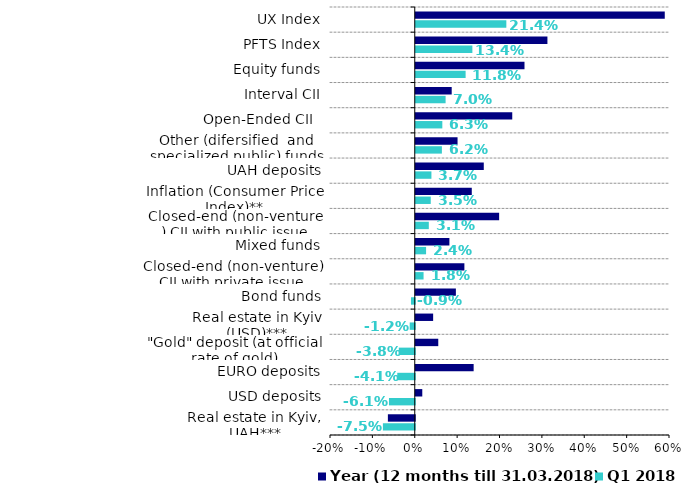
| Category | Q1 2018 | Year (12 months till 31.03.2018) |
|---|---|---|
| Real estate in Kyiv, UAH*** | -0.075 | -0.063 |
| USD deposits | -0.061 | 0.015 |
| EURO deposits | -0.041 | 0.137 |
| "Gold" deposit (at official rate of gold) | -0.038 | 0.053 |
| Real estate in Kyiv (USD)*** | -0.012 | 0.041 |
| Bond funds | -0.009 | 0.095 |
| Closed-end (non-venture) CII with private issue | 0.018 | 0.115 |
| Mixed funds | 0.024 | 0.079 |
| Closed-end (non-venture ) CII with public issue | 0.031 | 0.197 |
| Inflation (Consumer Price Index)** | 0.035 | 0.132 |
| UAH deposits | 0.037 | 0.161 |
| Other (difersified  and specialized public) funds | 0.062 | 0.099 |
| Open-Ended CII   | 0.063 | 0.228 |
| Interval CII | 0.07 | 0.085 |
| Equity funds | 0.118 | 0.257 |
| PFTS Index | 0.134 | 0.311 |
| UX Index | 0.214 | 0.588 |